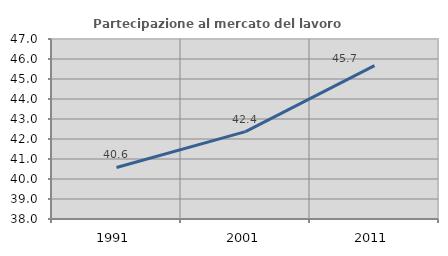
| Category | Partecipazione al mercato del lavoro  femminile |
|---|---|
| 1991.0 | 40.575 |
| 2001.0 | 42.37 |
| 2011.0 | 45.671 |